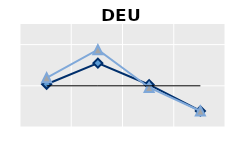
| Category | Né à l'étranger | Né dans le pays | Series 1 |
|---|---|---|---|
| 15-24 | 1.038 | 1.195 | 1 |
| 25-54 | 1.551 | 1.877 | 1 |
| 55-64 | 1.026 | 0.96 | 1 |
| 65+ | 0.388 | 0.389 | 1 |